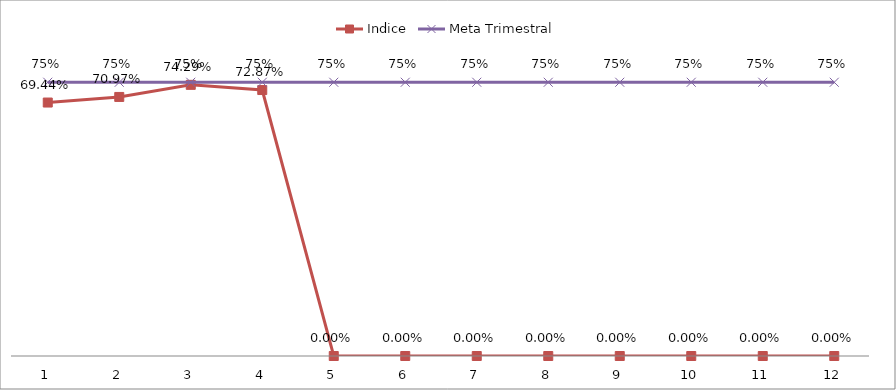
| Category | Indice | Meta Trimestral |
|---|---|---|
| 0 | 0.694 | 0.75 |
| 1 | 0.71 | 0.75 |
| 2 | 0.743 | 0.75 |
| 3 | 0.729 | 0.75 |
| 4 | 0 | 0.75 |
| 5 | 0 | 0.75 |
| 6 | 0 | 0.75 |
| 7 | 0 | 0.75 |
| 8 | 0 | 0.75 |
| 9 | 0 | 0.75 |
| 10 | 0 | 0.75 |
| 11 | 0 | 0.75 |